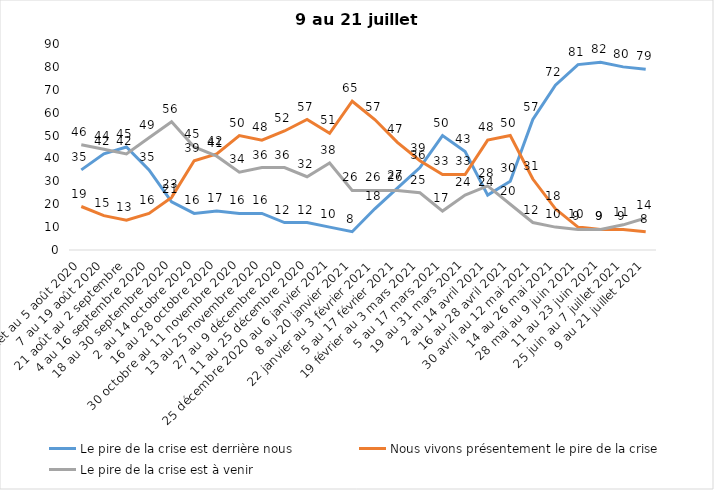
| Category | Le pire de la crise est derrière nous | Nous vivons présentement le pire de la crise | Le pire de la crise est à venir |
|---|---|---|---|
| 24 juillet au 5 août 2020 | 35 | 19 | 46 |
| 7 au 19 août 2020 | 42 | 15 | 44 |
| 21 août au 2 septembre | 45 | 13 | 42 |
| 4 au 16 septembre 2020 | 35 | 16 | 49 |
| 18 au 30 septembre 2020 | 21 | 23 | 56 |
| 2 au 14 octobre 2020 | 16 | 39 | 45 |
| 16 au 28 octobre 2020 | 17 | 42 | 41 |
| 30 octobre au 11 novembre 2020 | 16 | 50 | 34 |
| 13 au 25 novembre 2020 | 16 | 48 | 36 |
| 27 au 9 décembre 2020 | 12 | 52 | 36 |
| 11 au 25 décembre 2020 | 12 | 57 | 32 |
| 25 décembre 2020 au 6 janvier 2021 | 10 | 51 | 38 |
| 8 au 20 janvier 2021 | 8 | 65 | 26 |
| 22 janvier au 3 février 2021 | 18 | 57 | 26 |
| 5 au 17 février 2021 | 27 | 47 | 26 |
| 19 février au 3 mars 2021 | 36 | 39 | 25 |
| 5 au 17 mars 2021 | 50 | 33 | 17 |
| 19 au 31 mars 2021 | 43 | 33 | 24 |
| 2 au 14 avril 2021 | 24 | 48 | 28 |
| 16 au 28 avril 2021 | 30 | 50 | 20 |
| 30 avril au 12 mai 2021 | 57 | 31 | 12 |
| 14 au 26 mai 2021 | 72 | 18 | 10 |
| 28 mai au 9 juin 2021 | 81 | 10 | 9 |
| 11 au 23 juin 2021 | 82 | 9 | 9 |
| 25 juin au 7 juillet 2021 | 80 | 9 | 11 |
| 9 au 21 juillet 2021 | 79 | 8 | 14 |